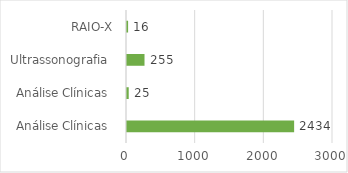
| Category | Series 0 |
|---|---|
| Análise Clínicas  | 2434 |
| Análise Clínicas  | 25 |
| Ultrassonografia  | 255 |
| RAIO-X | 16 |